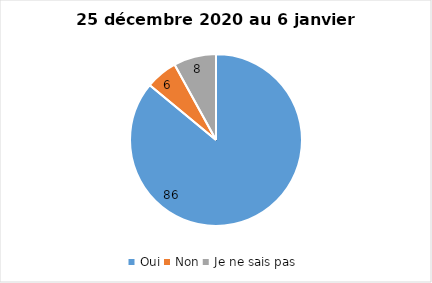
| Category | Series 0 |
|---|---|
| Oui | 86 |
| Non | 6 |
| Je ne sais pas | 8 |